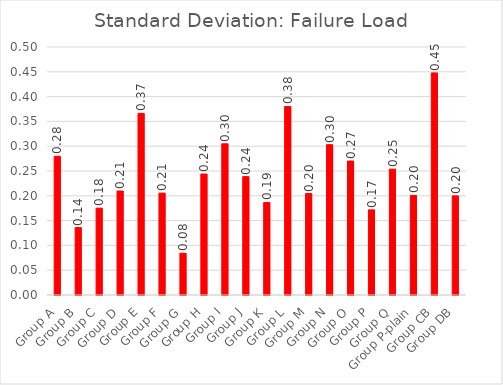
| Category | Standard Deviation |
|---|---|
| Group A | 0.28 |
| Group B | 0.136 |
| Group C | 0.175 |
| Group D | 0.21 |
| Group E | 0.366 |
| Group F | 0.205 |
| Group G | 0.084 |
| Group H | 0.244 |
| Group I | 0.305 |
| Group J | 0.239 |
| Group K | 0.187 |
| Group L | 0.38 |
| Group M | 0.205 |
| Group N | 0.303 |
| Group O | 0.27 |
| Group P | 0.172 |
| Group Q | 0.254 |
| Group P-plain | 0.201 |
| Group CB | 0.448 |
| Group DB | 0.2 |